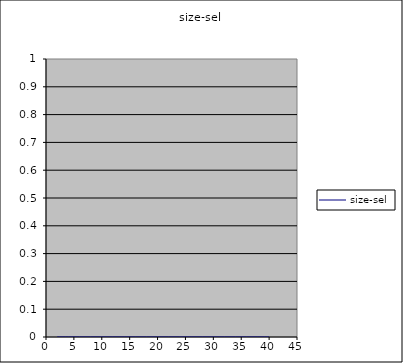
| Category | size-sel |
|---|---|
| 2.0 | 0 |
| 4.0 | 0 |
| 6.0 | 0 |
| 8.0 | 0 |
| 10.0 | 0 |
| 12.0 | 0 |
| 14.0 | 0 |
| 16.0 | 0 |
| 18.0 | 0 |
| 20.0 | 0 |
| 22.0 | 0 |
| 24.0 | 0 |
| 26.0 | 0 |
| 28.0 | 0 |
| 30.0 | 0 |
| 32.0 | 0 |
| 34.0 | 0 |
| 36.0 | 0 |
| 38.0 | 0 |
| 40.0 | 0 |